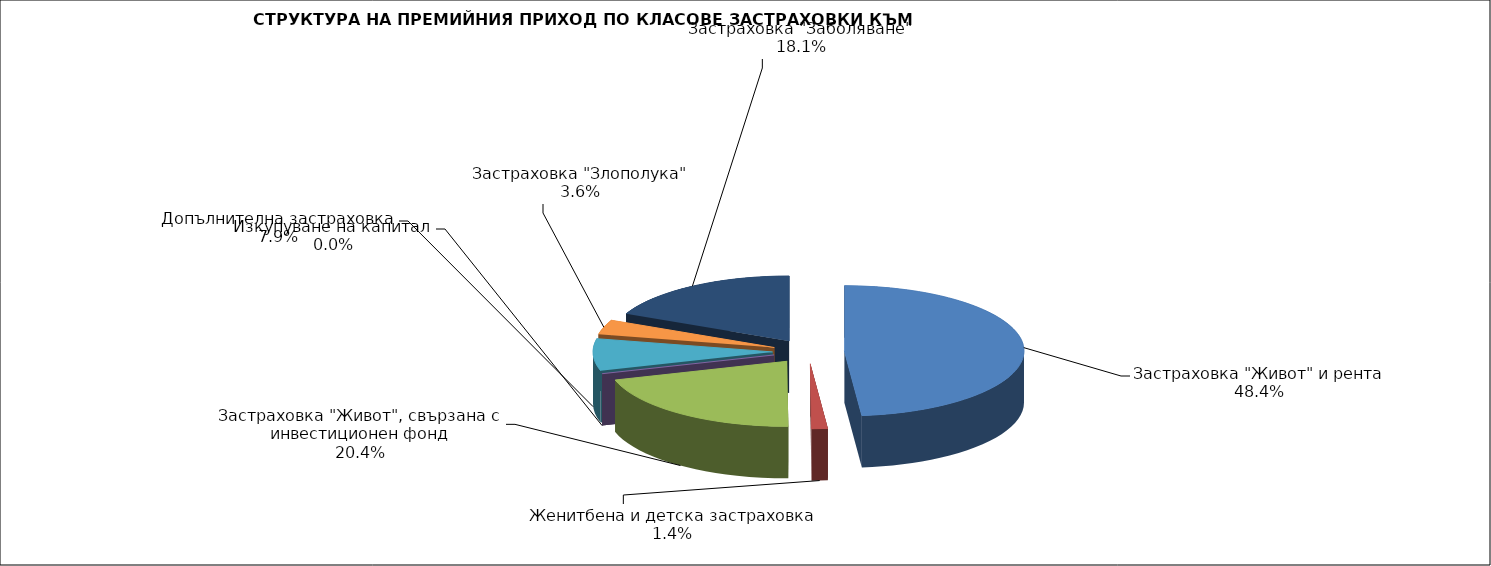
| Category | Series 0 |
|---|---|
| Застраховка "Живот" и рента | 77518805.854 |
| Женитбена и детска застраховка | 2319982.554 |
| Застраховка "Живот", свързана с инвестиционен фонд | 32719841.275 |
| Изкупуване на капитал | 0 |
| Допълнителна застраховка | 12663200.023 |
| Застраховка "Злополука" | 5807498.31 |
| Застраховка "Заболяване" | 28979790.04 |